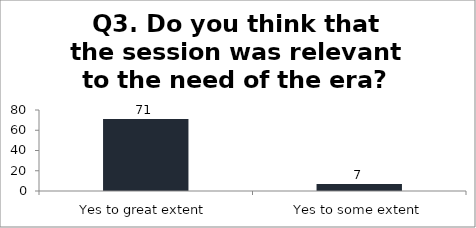
| Category | Q3. Do you think that the session was relevant to the need of the era? |
|---|---|
| Yes to great extent | 71 |
| Yes to some extent | 7 |